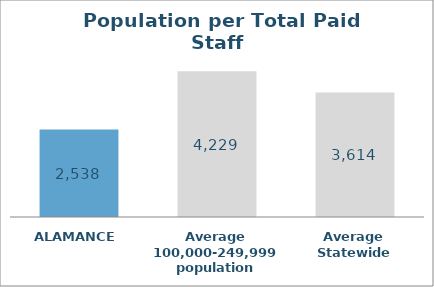
| Category | Series 0 |
|---|---|
| ALAMANCE | 2538.415 |
| Average 100,000-249,999 population | 4228.959 |
| Average Statewide | 3613.761 |